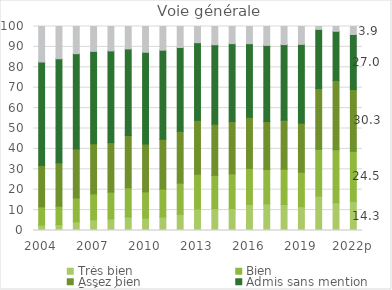
| Category | Très bien | Bien | Assez bien | Admis sans mention | Refusé |
|---|---|---|---|---|---|
| 2004 | 2.7 | 8.885 | 20.329 | 50.678 | 17.409 |
| 2005 | 2.893 | 9.04 | 21.268 | 50.992 | 15.807 |
| 2006 | 4.257 | 11.711 | 24.008 | 46.703 | 13.32 |
| 2007 | 5.232 | 12.708 | 24.578 | 45.303 | 12.178 |
| 2008 | 5.699 | 13.122 | 24.275 | 44.937 | 11.967 |
| 2009 | 6.64 | 14.323 | 25.601 | 42.442 | 10.993 |
| 2010 | 6.078 | 12.866 | 23.445 | 44.982 | 12.63 |
| 2011 | 6.638 | 13.657 | 24.424 | 43.666 | 11.614 |
| 2012 | 7.984 | 15.239 | 25.424 | 41.07 | 10.283 |
| 2013 | 10.534 | 17.047 | 26.404 | 38.076 | 7.939 |
| 2014 | 10.744 | 16.275 | 25.106 | 38.934 | 8.94 |
| 2015 | 10.833 | 16.977 | 25.662 | 38.126 | 8.402 |
| 2016 | 12.791 | 17.658 | 25.05 | 36.088 | 8.412 |
| 2017 | 13.024 | 16.889 | 23.495 | 37.339 | 9.253 |
| 2018 | 12.734 | 17.344 | 24.018 | 37.033 | 8.872 |
| 2019 | 11.727 | 16.814 | 24.096 | 38.616 | 8.747 |
| 2020 | 16.855 | 22.924 | 29.844 | 28.968 | 1.408 |
| 2021 | 13.63 | 25.956 | 33.99 | 24.07 | 2.353 |
| 2022p | 14.268 | 24.523 | 30.338 | 26.964 | 3.908 |